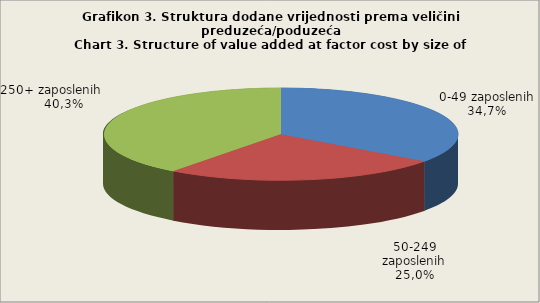
| Category | Broj zaposlenih osoba
Number of persons employed
  |
|---|---|
| 0-49 zaposlenih | 35 |
| 50-249 zaposlenih | 25.3 |
| 250+ zaposlenih | 39.7 |